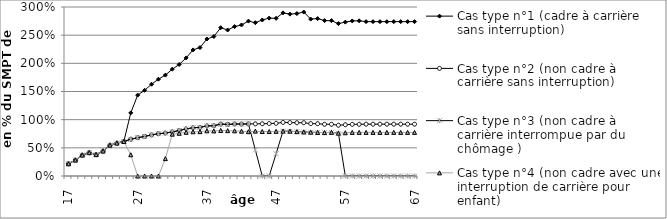
| Category | Cas type n°1 (cadre à carrière sans interruption) | Cas type n°2 (non cadre à carrière sans interruption) | Cas type n°3 (non cadre à carrière interrompue par du chômage ) | Cas type n°4 (non cadre avec une interruption de carrière pour enfant) |
|---|---|---|---|---|
| 17.0 | 0.217 | 0.217 | 0.217 | 0.217 |
| 18.0 | 0.283 | 0.283 | 0.283 | 0.283 |
| 19.0 | 0.371 | 0.371 | 0.371 | 0.371 |
| 20.0 | 0.414 | 0.414 | 0.414 | 0.414 |
| 21.0 | 0.38 | 0.38 | 0.38 | 0.38 |
| 22.0 | 0.443 | 0.443 | 0.443 | 0.443 |
| 23.0 | 0.547 | 0.547 | 0.547 | 0.547 |
| 24.0 | 0.585 | 0.585 | 0.585 | 0.585 |
| 25.0 | 0.613 | 0.613 | 0.613 | 0.613 |
| 26.0 | 1.12 | 0.653 | 0.653 | 0.377 |
| 27.0 | 1.436 | 0.68 | 0.68 | 0 |
| 28.0 | 1.521 | 0.702 | 0.702 | 0 |
| 29.0 | 1.629 | 0.729 | 0.729 | 0 |
| 30.0 | 1.718 | 0.751 | 0.751 | 0 |
| 31.0 | 1.791 | 0.762 | 0.762 | 0.308 |
| 32.0 | 1.896 | 0.783 | 0.783 | 0.743 |
| 33.0 | 1.979 | 0.807 | 0.807 | 0.758 |
| 34.0 | 2.097 | 0.836 | 0.836 | 0.775 |
| 35.0 | 2.238 | 0.857 | 0.857 | 0.785 |
| 36.0 | 2.28 | 0.862 | 0.862 | 0.787 |
| 37.0 | 2.432 | 0.89 | 0.89 | 0.802 |
| 38.0 | 2.477 | 0.892 | 0.892 | 0.8 |
| 39.0 | 2.632 | 0.921 | 0.921 | 0.809 |
| 40.0 | 2.591 | 0.916 | 0.916 | 0.805 |
| 41.0 | 2.652 | 0.923 | 0.923 | 0.802 |
| 42.0 | 2.681 | 0.922 | 0.922 | 0.796 |
| 43.0 | 2.75 | 0.925 | 0.925 | 0.787 |
| 44.0 | 2.722 | 0.925 | 0.463 | 0.797 |
| 45.0 | 2.769 | 0.928 | 0 | 0.79 |
| 46.0 | 2.803 | 0.931 | 0 | 0.789 |
| 47.0 | 2.799 | 0.935 | 0.396 | 0.793 |
| 48.0 | 2.896 | 0.951 | 0.797 | 0.797 |
| 49.0 | 2.873 | 0.948 | 0.795 | 0.795 |
| 50.0 | 2.883 | 0.945 | 0.787 | 0.787 |
| 51.0 | 2.91 | 0.946 | 0.782 | 0.782 |
| 52.0 | 2.785 | 0.93 | 0.778 | 0.778 |
| 53.0 | 2.794 | 0.928 | 0.773 | 0.773 |
| 54.0 | 2.759 | 0.918 | 0.77 | 0.77 |
| 55.0 | 2.757 | 0.918 | 0.775 | 0.775 |
| 56.0 | 2.705 | 0.901 | 0.76 | 0.76 |
| 57.0 | 2.732 | 0.91 | 0 | 0.768 |
| 58.0 | 2.752 | 0.917 | 0 | 0.774 |
| 59.0 | 2.755 | 0.918 | 0 | 0.774 |
| 60.0 | 2.74 | 0.92 | 0 | 0.774 |
| 61.0 | 2.74 | 0.92 | 0 | 0.774 |
| 62.0 | 2.74 | 0.92 | 0 | 0.774 |
| 63.0 | 2.74 | 0.92 | 0 | 0.774 |
| 64.0 | 2.74 | 0.92 | 0 | 0.774 |
| 65.0 | 2.74 | 0.92 | 0 | 0.774 |
| 66.0 | 2.74 | 0.92 | 0 | 0.774 |
| 67.0 | 2.74 | 0.92 | 0 | 0.774 |